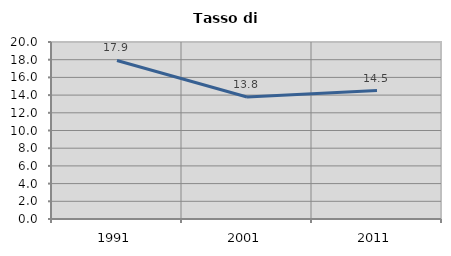
| Category | Tasso di disoccupazione   |
|---|---|
| 1991.0 | 17.916 |
| 2001.0 | 13.785 |
| 2011.0 | 14.518 |